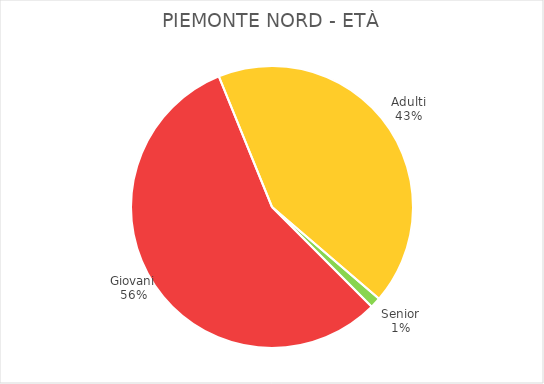
| Category | Piemonte Nord |
|---|---|
| Giovani | 3366 |
| Adulti | 2535 |
| Senior | 73 |